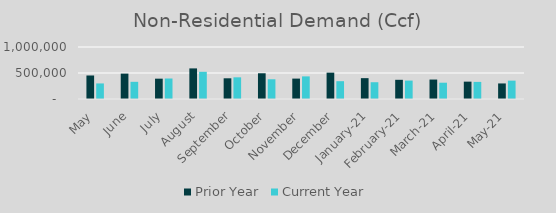
| Category | Prior Year | Current Year |
|---|---|---|
| May | 452130.67 | 299245.56 |
| June | 488107.52 | 330441.187 |
| July | 390975.65 | 394304.316 |
| August | 588468.22 | 522963.473 |
| September | 398263 | 416886.629 |
| October | 494775 | 379515 |
| November | 392357 | 434815 |
| December | 507022 | 342584.594 |
| January-21 | 400923.849 | 322657.16 |
| February-21 | 369131.684 | 354041 |
| March-21 | 374117 | 313343 |
| April-21 | 333800.488 | 329084.722 |
| May-21 | 299245.56 | 353085 |